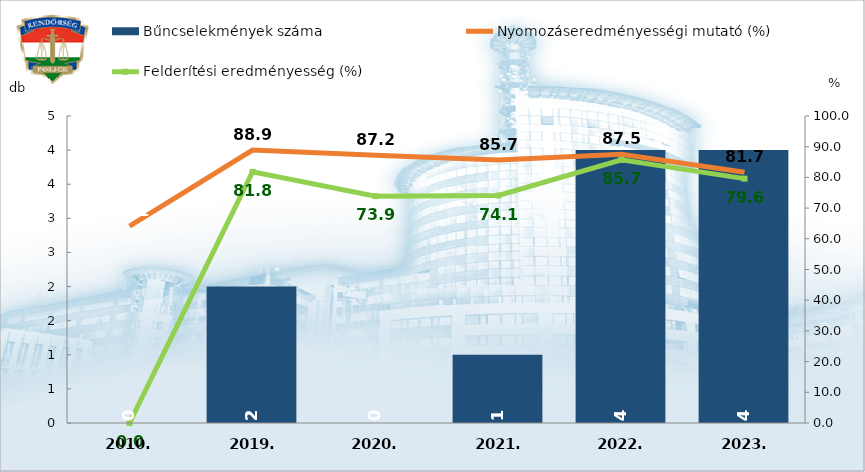
| Category | Bűncselekmények száma |
|---|---|
| 2010. | 0 |
| 2019. | 2 |
| 2020. | 0 |
| 2021. | 1 |
| 2022. | 4 |
| 2023. | 4 |